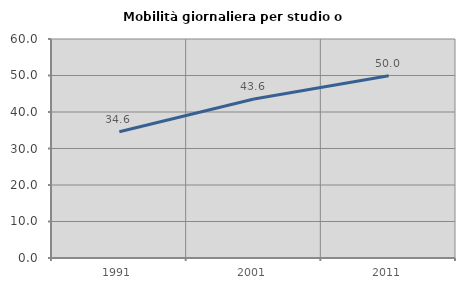
| Category | Mobilità giornaliera per studio o lavoro |
|---|---|
| 1991.0 | 34.61 |
| 2001.0 | 43.57 |
| 2011.0 | 49.954 |